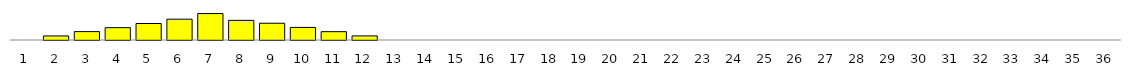
| Category | Series 0 |
|---|---|
| 1.0 | 0 |
| 2.0 | 0.027 |
| 3.0 | 0.056 |
| 4.0 | 0.082 |
| 5.0 | 0.11 |
| 6.0 | 0.139 |
| 7.0 | 0.176 |
| 8.0 | 0.131 |
| 9.0 | 0.112 |
| 10.0 | 0.084 |
| 11.0 | 0.056 |
| 12.0 | 0.027 |
| 13.0 | 0 |
| 14.0 | 0 |
| 15.0 | 0 |
| 16.0 | 0 |
| 17.0 | 0 |
| 18.0 | 0 |
| 19.0 | 0 |
| 20.0 | 0 |
| 21.0 | 0 |
| 22.0 | 0 |
| 23.0 | 0 |
| 24.0 | 0 |
| 25.0 | 0 |
| 26.0 | 0 |
| 27.0 | 0 |
| 28.0 | 0 |
| 29.0 | 0 |
| 30.0 | 0 |
| 31.0 | 0 |
| 32.0 | 0 |
| 33.0 | 0 |
| 34.0 | 0 |
| 35.0 | 0 |
| 36.0 | 0 |